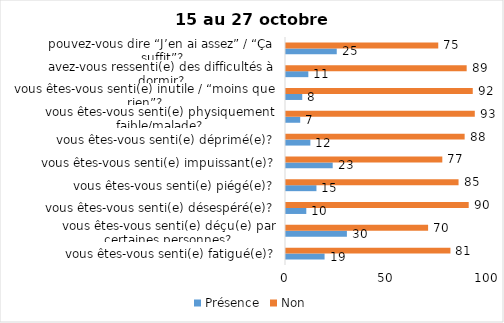
| Category | Présence | Non |
|---|---|---|
| vous êtes-vous senti(e) fatigué(e)? | 19 | 81 |
| vous êtes-vous senti(e) déçu(e) par certaines personnes? | 30 | 70 |
| vous êtes-vous senti(e) désespéré(e)? | 10 | 90 |
| vous êtes-vous senti(e) piégé(e)? | 15 | 85 |
| vous êtes-vous senti(e) impuissant(e)? | 23 | 77 |
| vous êtes-vous senti(e) déprimé(e)? | 12 | 88 |
| vous êtes-vous senti(e) physiquement faible/malade? | 7 | 93 |
| vous êtes-vous senti(e) inutile / “moins que rien”? | 8 | 92 |
| avez-vous ressenti(e) des difficultés à dormir? | 11 | 89 |
| pouvez-vous dire “J’en ai assez” / “Ça suffit”? | 25 | 75 |